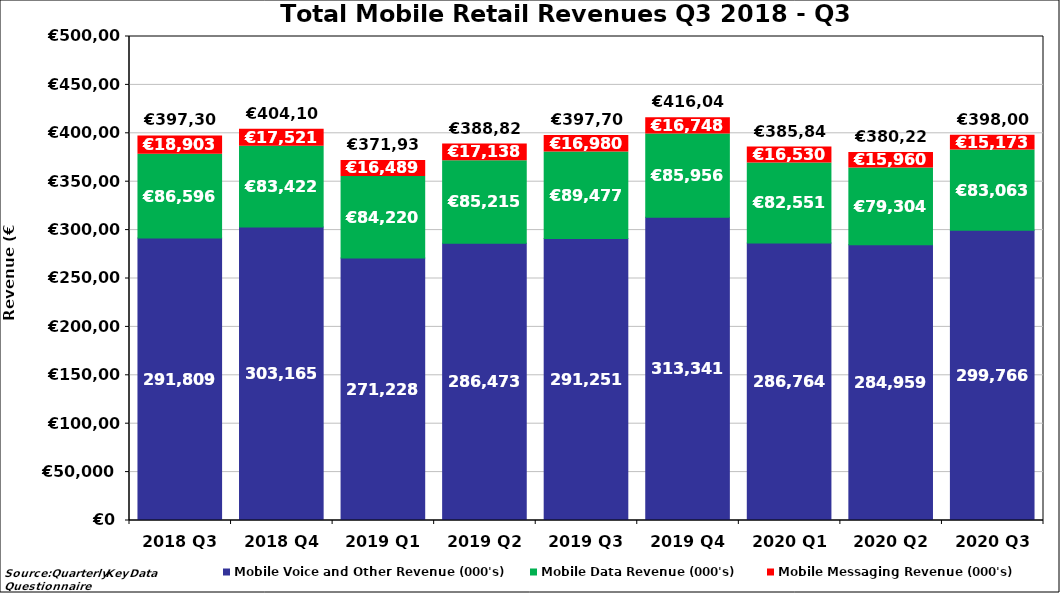
| Category | Mobile Voice and Other Revenue (000's) | Mobile Data Revenue (000's) | Mobile Messaging Revenue (000's) |
|---|---|---|---|
| 2018 Q3 | 291809.34 | 86596.18 | 18902.773 |
| 2018 Q4 | 303165.011 | 83421.682 | 17521.425 |
| 2019 Q1 | 271228.262 | 84220.478 | 16488.962 |
| 2019 Q2 | 286472.553 | 85214.89 | 17138.438 |
| 2019 Q3 | 291250.878 | 89477.355 | 16980.077 |
| 2019 Q4 | 313340.616 | 85955.659 | 16747.708 |
| 2020 Q1 | 286764 | 82551 | 16530.453 |
| 2020 Q2 | 284959 | 79304 | 15960 |
| 2020 Q3 | 299766 | 83063 | 15173 |